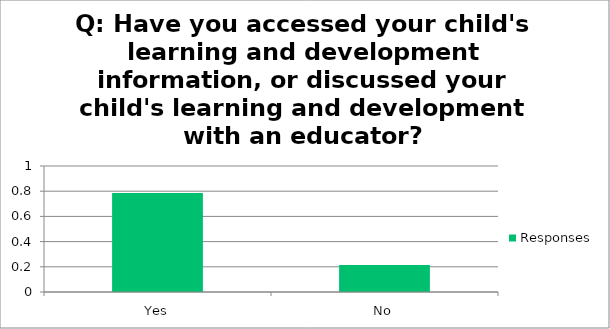
| Category | Responses |
|---|---|
| Yes | 0.786 |
| No | 0.214 |